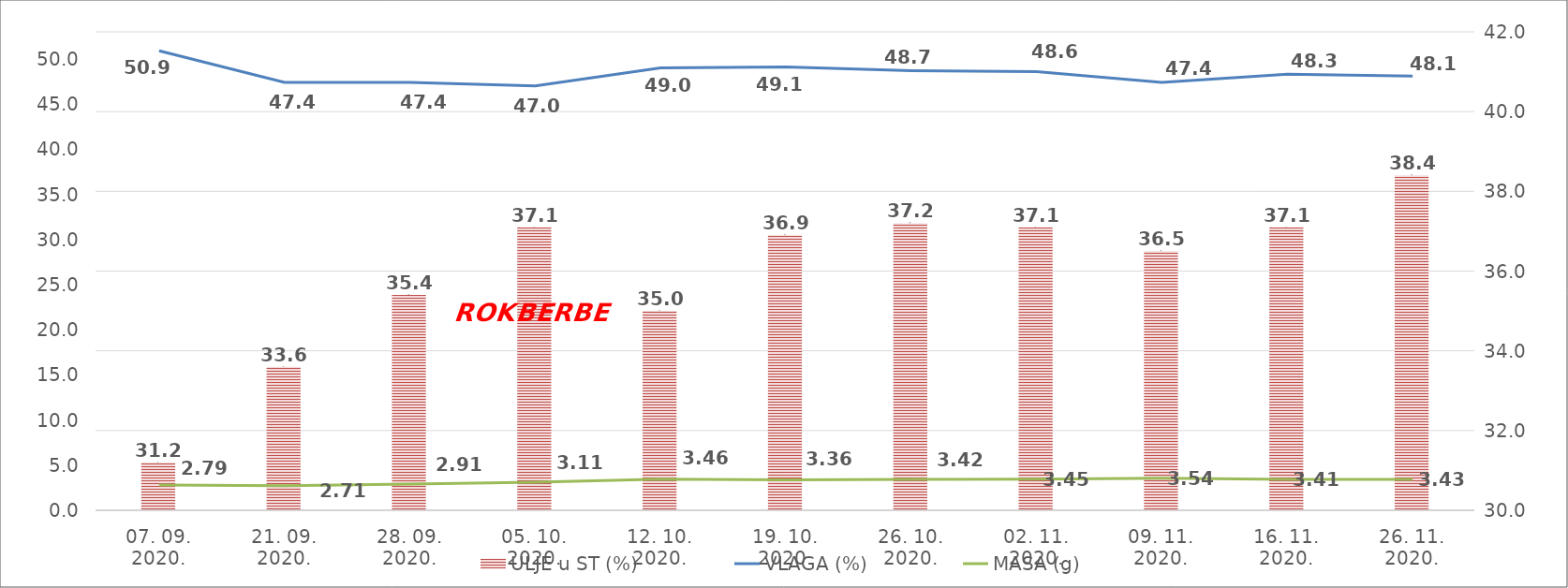
| Category | ULJE u ST (%) |
|---|---|
| 07. 09. 2020. | 31.2 |
| 21. 09. 2020. | 33.6 |
| 28. 09. 2020. | 35.4 |
| 05. 10. 2020. | 37.1 |
| 12. 10. 2020. | 35 |
| 19. 10. 2020. | 36.9 |
| 26. 10. 2020. | 37.2 |
| 02. 11. 2020. | 37.1 |
| 09. 11. 2020. | 36.5 |
| 16. 11. 2020. | 37.1 |
| 26. 11. 2020. | 38.4 |